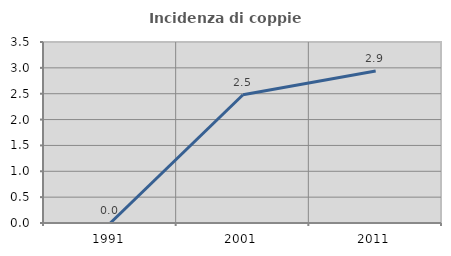
| Category | Incidenza di coppie miste |
|---|---|
| 1991.0 | 0 |
| 2001.0 | 2.479 |
| 2011.0 | 2.941 |